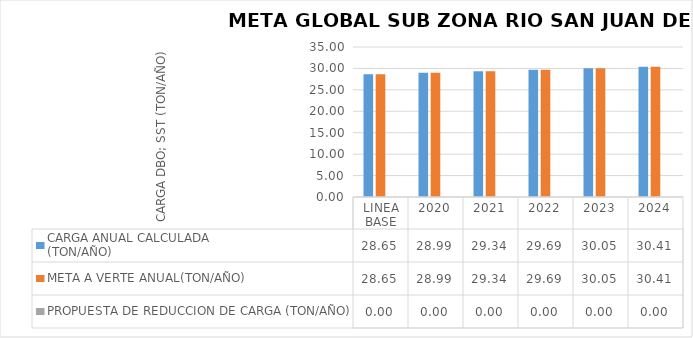
| Category | CARGA ANUAL CALCULADA
(TON/AÑO) | META A VERTE ANUAL(TON/AÑO) | PROPUESTA DE REDUCCION DE CARGA (TON/AÑO) |
|---|---|---|---|
| LINEA BASE
 | 28.645 | 28.645 | 0 |
| 2020 | 28.989 | 28.989 | 0 |
| 2021 | 29.337 | 29.337 | 0 |
| 2022 | 29.689 | 29.689 | 0 |
| 2023 | 30.045 | 30.045 | 0 |
| 2024 | 30.406 | 30.406 | 0 |